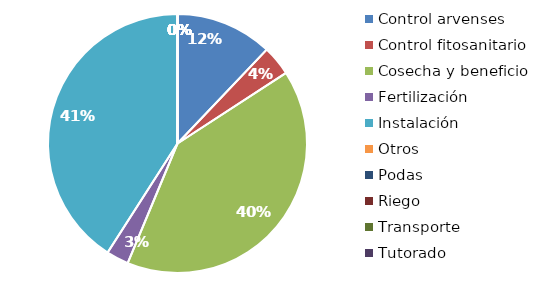
| Category | Valor |
|---|---|
| Control arvenses | 650000 |
| Control fitosanitario | 200000 |
| Cosecha y beneficio | 2175000 |
| Fertilización | 150000 |
| Instalación | 2200000 |
| Otros | 0 |
| Podas | 0 |
| Riego | 0 |
| Transporte | 0 |
| Tutorado | 0 |